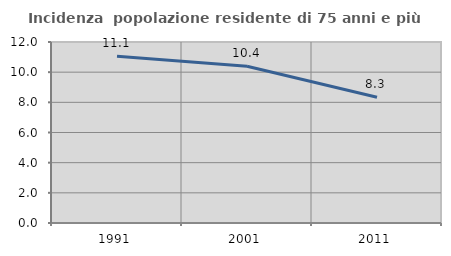
| Category | Incidenza  popolazione residente di 75 anni e più |
|---|---|
| 1991.0 | 11.055 |
| 2001.0 | 10.396 |
| 2011.0 | 8.333 |